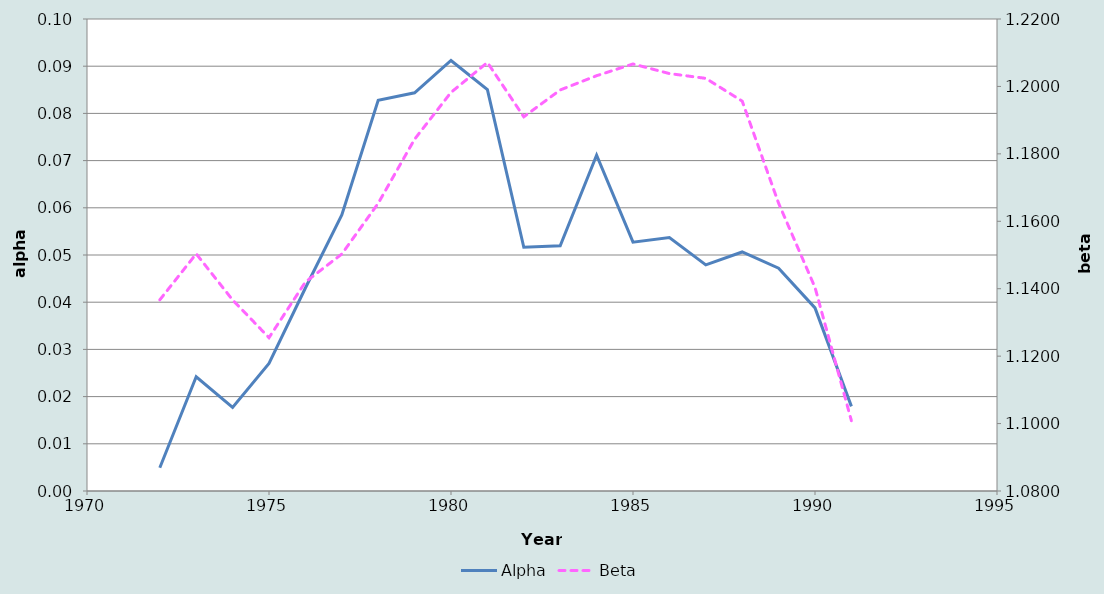
| Category | Alpha |
|---|---|
| 1972.0 | 0.005 |
| 1973.0 | 0.024 |
| 1974.0 | 0.018 |
| 1975.0 | 0.027 |
| 1976.0 | 0.043 |
| 1977.0 | 0.058 |
| 1978.0 | 0.083 |
| 1979.0 | 0.084 |
| 1980.0 | 0.091 |
| 1981.0 | 0.085 |
| 1982.0 | 0.052 |
| 1983.0 | 0.052 |
| 1984.0 | 0.071 |
| 1985.0 | 0.053 |
| 1986.0 | 0.054 |
| 1987.0 | 0.048 |
| 1988.0 | 0.051 |
| 1989.0 | 0.047 |
| 1990.0 | 0.039 |
| 1991.0 | 0.018 |